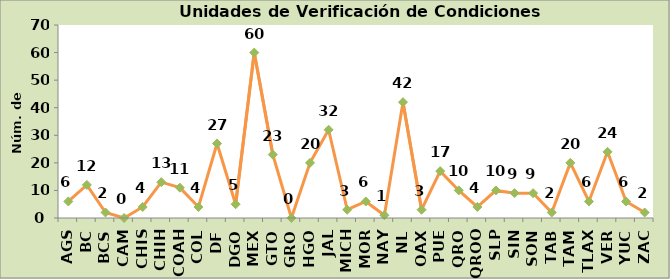
| Category | Total |
|---|---|
| AGS | 6 |
| BC | 12 |
| BCS | 2 |
| CAM | 0 |
| CHIS | 4 |
| CHIH | 13 |
| COAH | 11 |
| COL | 4 |
| DF | 27 |
| DGO | 5 |
| MEX | 60 |
| GTO | 23 |
| GRO | 0 |
| HGO | 20 |
| JAL | 32 |
| MICH | 3 |
| MOR | 6 |
| NAY | 1 |
| NL | 42 |
| OAX | 3 |
| PUE | 17 |
| QRO | 10 |
| QROO | 4 |
| SLP | 10 |
| SIN | 9 |
| SON | 9 |
| TAB | 2 |
| TAM | 20 |
| TLAX | 6 |
| VER | 24 |
| YUC | 6 |
| ZAC | 2 |